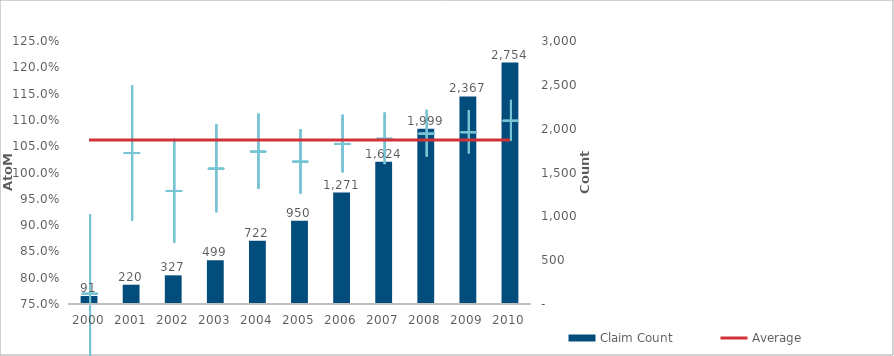
| Category | Claim Count |
|---|---|
| 0 | 91 |
| 1 | 220 |
| 2 | 327 |
| 3 | 499 |
| 4 | 722 |
| 5 | 950 |
| 6 | 1271 |
| 7 | 1624 |
| 8 | 1999 |
| 9 | 2367 |
| 10 | 2754 |